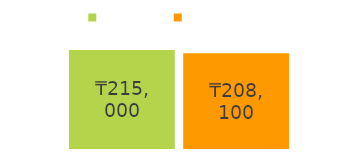
| Category | түсетін | шығатын |
|---|---|---|
| түсетін ақша: | 215000 | 208100 |